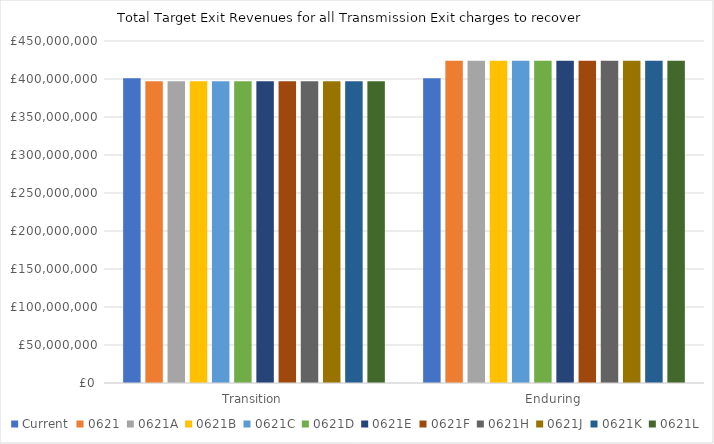
| Category | Current | 0621 | 0621A | 0621B | 0621C | 0621D | 0621E | 0621F | 0621H | 0621J | 0621K | 0621L |
|---|---|---|---|---|---|---|---|---|---|---|---|---|
| Transition | 401102910 | 397190500 | 397190500 | 397190500 | 397190500 | 397190500 | 397190500 | 397190500 | 397190500 | 397190500 | 397190500 | 397190500 |
| Enduring | 401102910 | 423999000 | 423999000 | 423999000 | 423999000 | 423999000 | 423999000 | 423999000 | 423999000 | 423999000 | 423999000 | 423999000 |